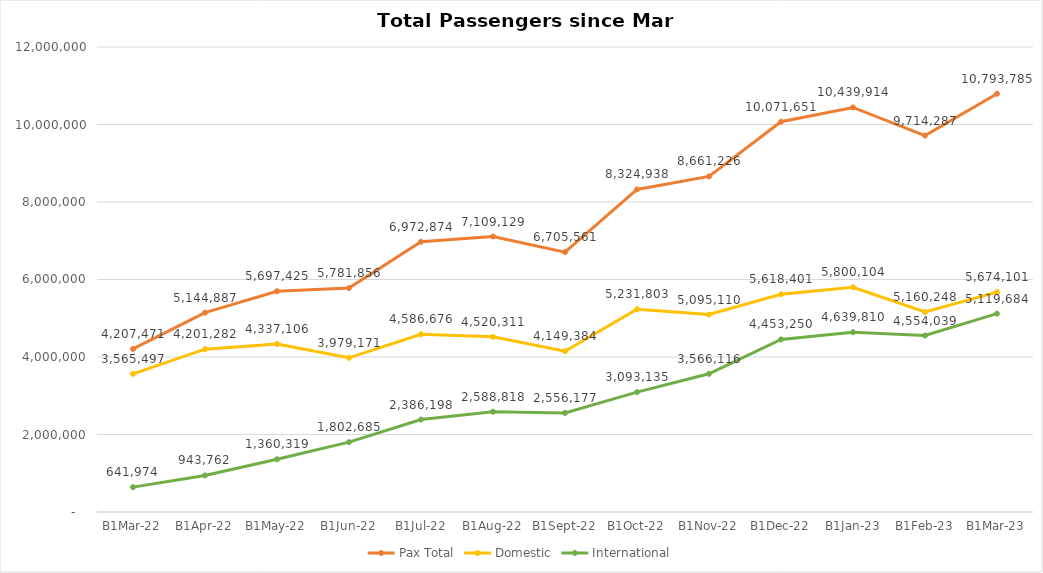
| Category | Pax Total |  Domestic  |  International  |
|---|---|---|---|
| 2022-03-01 | 4207471 | 3565497 | 641974 |
| 2022-04-01 | 5144887 | 4201282 | 943762 |
| 2022-05-01 | 5697425 | 4337106 | 1360319 |
| 2022-06-01 | 5781856 | 3979171 | 1802685 |
| 2022-07-01 | 6972874 | 4586676 | 2386198 |
| 2022-08-01 | 7109129 | 4520311 | 2588818 |
| 2022-09-01 | 6705561 | 4149384 | 2556177 |
| 2022-10-01 | 8324938 | 5231803 | 3093135 |
| 2022-11-01 | 8661226 | 5095110 | 3566116 |
| 2022-12-01 | 10071651 | 5618401 | 4453250 |
| 2023-01-01 | 10439914 | 5800104 | 4639810 |
| 2023-02-01 | 9714287 | 5160248 | 4554039 |
| 2023-03-01 | 10793785 | 5674101 | 5119684 |